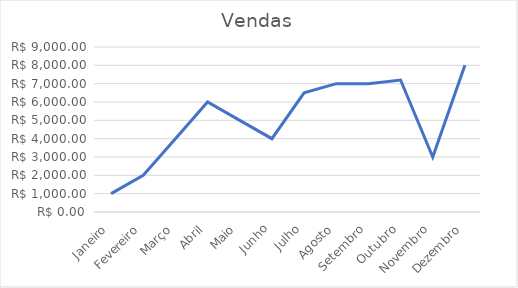
| Category | Vendas |
|---|---|
| Janeiro | 1000 |
| Fevereiro | 2000 |
| Março | 4000 |
| Abril | 6000 |
| Maio | 5000 |
| Junho | 4000 |
| Julho | 6500 |
| Agosto | 7000 |
| Setembro | 7000 |
| Outubro | 7200 |
| Novembro | 3000 |
| Dezembro | 8000 |